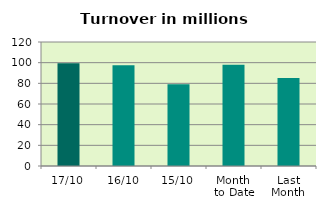
| Category | Series 0 |
|---|---|
| 17/10 | 99.353 |
| 16/10 | 97.485 |
| 15/10 | 79.102 |
| Month 
to Date | 98.079 |
| Last
Month | 85.072 |